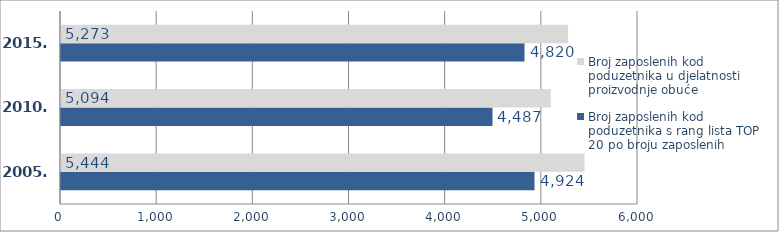
| Category | Broj zaposlenih kod poduzetnika s rang lista TOP 20 po broju zaposlenih  | Broj zaposlenih kod poduzetnika u djelatnosti proizvodnje obuće |
|---|---|---|
| 2005. | 4924 | 5444 |
| 2010. | 4487 | 5094 |
| 2015. | 4820 | 5273 |